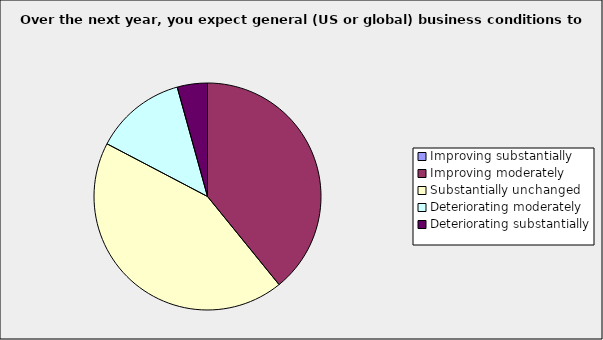
| Category | Series 0 |
|---|---|
| Improving substantially | 0 |
| Improving moderately | 0.391 |
| Substantially unchanged | 0.435 |
| Deteriorating moderately | 0.13 |
| Deteriorating substantially | 0.043 |